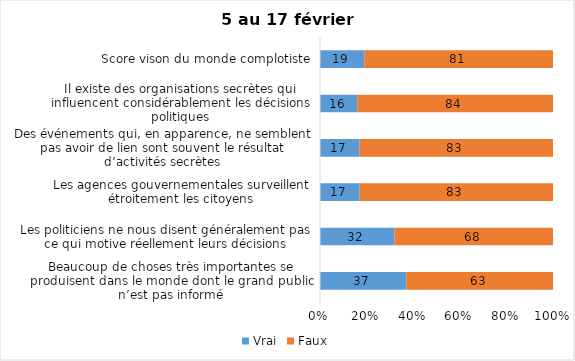
| Category | Vrai | Faux |
|---|---|---|
| Beaucoup de choses très importantes se produisent dans le monde dont le grand public n’est pas informé | 37 | 63 |
| Les politiciens ne nous disent généralement pas ce qui motive réellement leurs décisions | 32 | 68 |
| Les agences gouvernementales surveillent étroitement les citoyens | 17 | 83 |
| Des événements qui, en apparence, ne semblent pas avoir de lien sont souvent le résultat d’activités secrètes | 17 | 83 |
| Il existe des organisations secrètes qui influencent considérablement les décisions politiques | 16 | 84 |
| Score vison du monde complotiste | 19 | 81 |